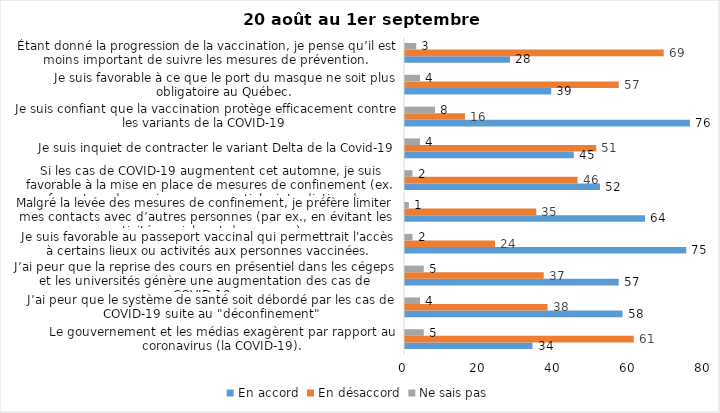
| Category | En accord | En désaccord | Ne sais pas |
|---|---|---|---|
| Le gouvernement et les médias exagèrent par rapport au coronavirus (la COVID-19). | 34 | 61 | 5 |
| J’ai peur que le système de santé soit débordé par les cas de COVID-19 suite au "déconfinement" | 58 | 38 | 4 |
| J’ai peur que la reprise des cours en présentiel dans les cégeps et les universités génère une augmentation des cas de COVID-19. | 57 | 37 | 5 |
| Je suis favorable au passeport vaccinal qui permettrait l'accès à certains lieux ou activités aux personnes vaccinées. | 75 | 24 | 2 |
| Malgré la levée des mesures de confinement, je préfère limiter mes contacts avec d’autres personnes (par ex., en évitant les activités sociales et de groupes) | 64 | 35 | 1 |
| Si les cas de COVID-19 augmentent cet automne, je suis favorable à la mise en place de mesures de confinement (ex. fermeture de services non essentiels, interdiction des rassemblements privés) | 52 | 46 | 2 |
| Je suis inquiet de contracter le variant Delta de la Covid-19 | 45 | 51 | 4 |
| Je suis confiant que la vaccination protège efficacement contre les variants de la COVID-19 | 76 | 16 | 8 |
| Je suis favorable à ce que le port du masque ne soit plus obligatoire au Québec. | 39 | 57 | 4 |
| Étant donné la progression de la vaccination, je pense qu’il est moins important de suivre les mesures de prévention. | 28 | 69 | 3 |